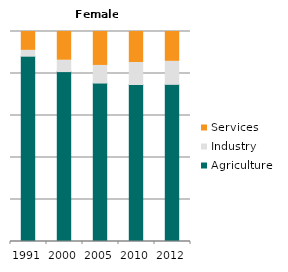
| Category | Agriculture | Industry | Services |
|---|---|---|---|
| 1991.0 | 88.241 | 2.772 | 8.987 |
| 2000.0 | 80.912 | 5.406 | 13.682 |
| 2005.0 | 75.449 | 8.389 | 16.162 |
| 2010.0 | 74.756 | 10.487 | 14.757 |
| 2012.0 | 74.84 | 10.953 | 14.207 |